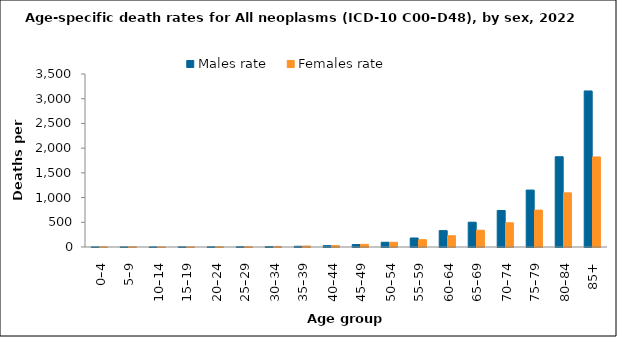
| Category | Males rate | Females rate |
|---|---|---|
| 0–4 | 2.187 | 1.903 |
| 5–9 | 1.688 | 3.322 |
| 10–14 | 2.019 | 1.13 |
| 15–19 | 3.161 | 1.211 |
| 20–24 | 3.192 | 3.031 |
| 25–29 | 5.3 | 3.767 |
| 30–34 | 7.915 | 10.95 |
| 35–39 | 15.101 | 19.284 |
| 40–44 | 27.086 | 28.04 |
| 45–49 | 49.932 | 53.21 |
| 50–54 | 96.203 | 95.144 |
| 55–59 | 182.102 | 147.894 |
| 60–64 | 331.483 | 227.409 |
| 65–69 | 501.659 | 339.094 |
| 70–74 | 738.982 | 489.944 |
| 75–79 | 1151.976 | 746.412 |
| 80–84 | 1825.684 | 1095.394 |
| 85+ | 3156.812 | 1822.796 |